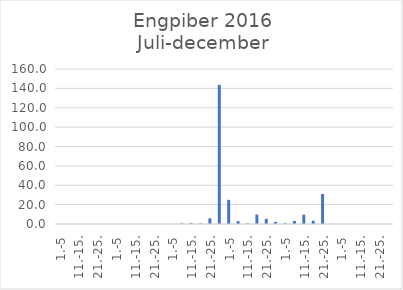
| Category | Series 0 |
|---|---|
| 1.-5 | 0 |
| 6.-10. | 0 |
| 11.-15. | 0 |
| 16.-20. | 0 |
| 21.-25. | 0 |
| 26.-31. | 0 |
| 1.-5 | 0 |
| 6.-10. | 0 |
| 11.-15. | 0 |
| 16.-20. | 0 |
| 21.-25. | 0 |
| 26.-31. | 0 |
| 1.-5 | 0 |
| 6.-10. | 0.627 |
| 11.-15. | 0.87 |
| 16.-20. | 0.476 |
| 21.-25. | 5.853 |
| 26.-30. | 143.562 |
| 1.-5 | 24.962 |
| 6.-10. | 2.891 |
| 11.-15. | 0.518 |
| 16.-20. | 9.65 |
| 21.-25. | 5.283 |
| 26.-31. | 2.23 |
| 1.-5 | 0.686 |
| 6.-10. | 3.132 |
| 11.-15. | 9.621 |
| 16.-20. | 3.357 |
| 21.-25. | 30.951 |
| 26.-30. | 0.133 |
| 1.-5 | 0 |
| 6.-10. | 0 |
| 11.-15. | 0.096 |
| 16.-20. | 0.086 |
| 21.-25. | 0 |
| 26.-31. | 0 |